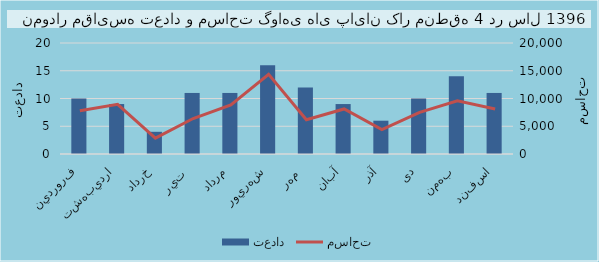
| Category | تعداد |
|---|---|
| فروردين | 10 |
| ارديبهشت | 9 |
| خرداد | 4 |
| تير  | 11 |
| مرداد | 11 |
| شهريور | 16 |
| مهر  | 12 |
| آبان | 9 |
| آذر | 6 |
| دی | 10 |
| بهمن | 14 |
| اسفند | 11 |